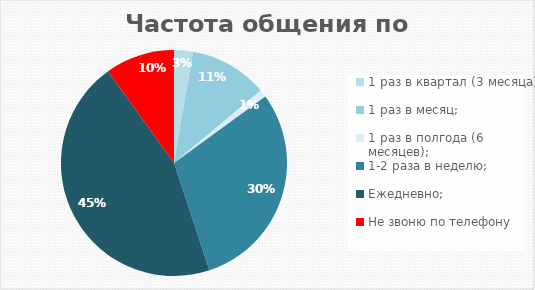
| Category | Итог |
|---|---|
| 1 раз в квартал (3 месяца); | 23 |
| 1 раз в месяц; | 95 |
| 1 раз в полгода (6 месяцев); | 9 |
| 1-2 раза в неделю; | 254 |
| Ежедневно; | 383 |
| Не звоню по телефону | 84 |